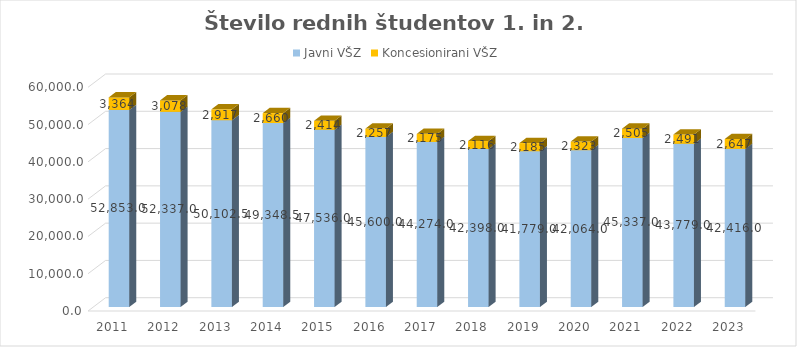
| Category | Javni VŠZ | Koncesionirani VŠZ |
|---|---|---|
| 2011.0 | 52853 | 3364 |
| 2012.0 | 52337 | 3078 |
| 2013.0 | 50102.5 | 2917 |
| 2014.0 | 49348.5 | 2660 |
| 2015.0 | 47536 | 2414 |
| 2016.0 | 45600 | 2257 |
| 2017.0 | 44274 | 2175 |
| 2018.0 | 42398 | 2116 |
| 2019.0 | 41779 | 2185 |
| 2020.0 | 42064 | 2323 |
| 2021.0 | 45337 | 2505 |
| 2022.0 | 43779 | 2491 |
| 2023.0 | 42416 | 2647 |